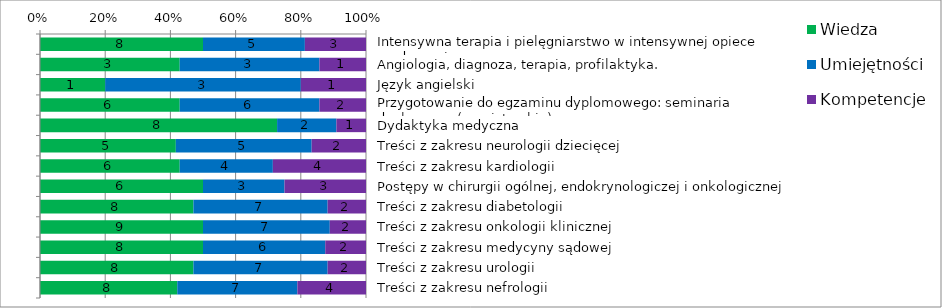
| Category | Wiedza | Umiejętności | Kompetencje |
|---|---|---|---|
| Intensywna terapia i pielęgniarstwo w intensywnej opiece medycznej | 8 | 5 | 3 |
| Angiologia, diagnoza, terapia, profilaktyka. | 3 | 3 | 1 |
| Język angielski | 1 | 3 | 1 |
| Przygotowanie do egzaminu dyplomowego: seminaria dyplomowe (magisterskie) | 6 | 6 | 2 |
| Dydaktyka medyczna | 8 | 2 | 1 |
| Treści z zakresu neurologii dziecięcej | 5 | 5 | 2 |
| Treści z zakresu kardiologii  | 6 | 4 | 4 |
| Postępy w chirurgii ogólnej, endokrynologiczej i onkologicznej | 6 | 3 | 3 |
| Treści z zakresu diabetologii | 8 | 7 | 2 |
| Treści z zakresu onkologii klinicznej | 9 | 7 | 2 |
| Treści z zakresu medycyny sądowej | 8 | 6 | 2 |
| Treści z zakresu urologii | 8 | 7 | 2 |
| Treści z zakresu nefrologii | 8 | 7 | 4 |